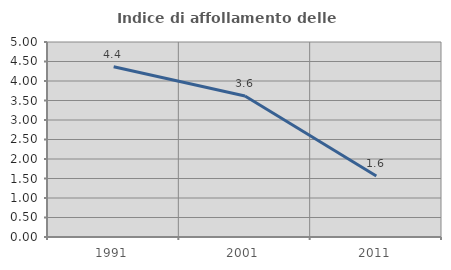
| Category | Indice di affollamento delle abitazioni  |
|---|---|
| 1991.0 | 4.364 |
| 2001.0 | 3.614 |
| 2011.0 | 1.562 |